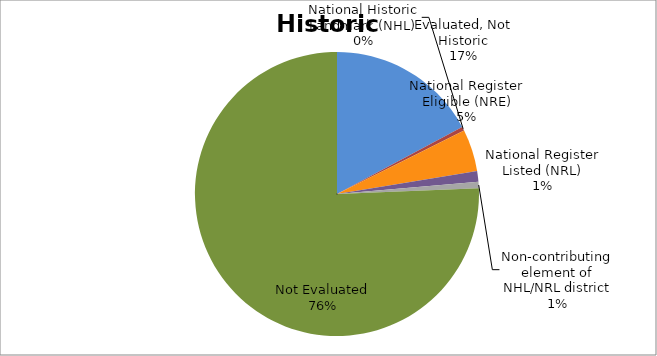
| Category | Series 0 |
|---|---|
| Evaluated, Not Historic | 150788 |
| National Historic Landmark (NHL) | 4057 |
| National Register Eligible (NRE) | 41921 |
| National Register Listed (NRL) | 10714 |
| Non-contributing element of NHL/NRL district | 6356 |
| Not Evaluated | 664142 |